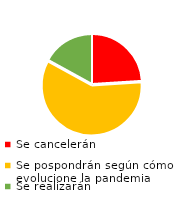
| Category | Series 0 |
|---|---|
| Se cancelerán | 24 |
| Se pospondrán según cómo evolucione la pandemia | 59 |
| Se realizarán | 17 |